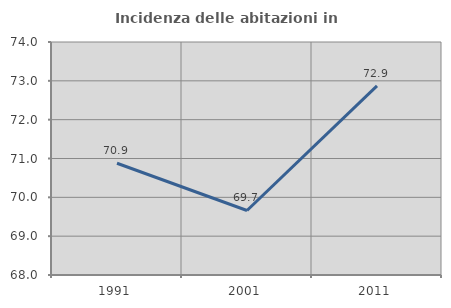
| Category | Incidenza delle abitazioni in proprietà  |
|---|---|
| 1991.0 | 70.877 |
| 2001.0 | 69.661 |
| 2011.0 | 72.872 |